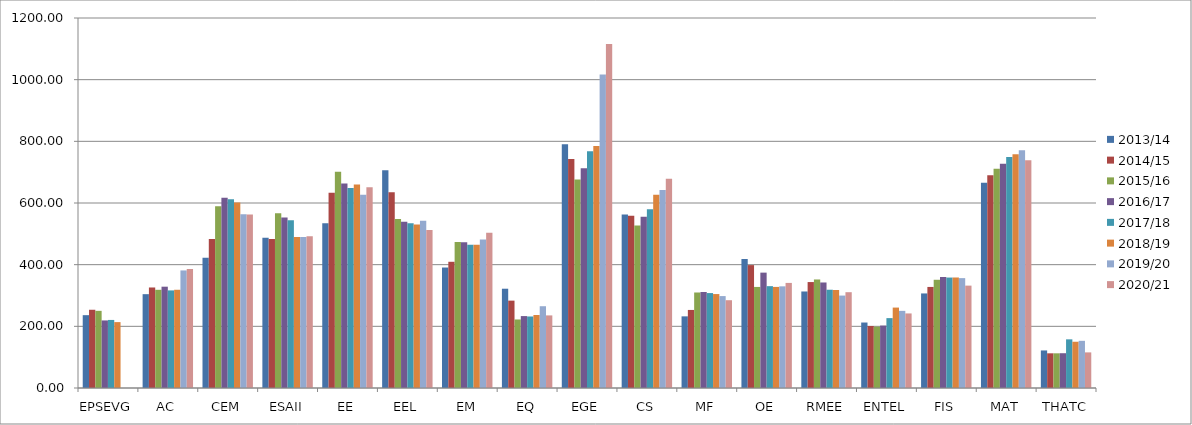
| Category | 2013/14 | 2014/15 | 2015/16 | 2016/17 | 2017/18 | 2018/19 | 2019/20 | 2020/21 |
|---|---|---|---|---|---|---|---|---|
| EPSEVG | 236.21 | 253.76 | 250.25 | 219.142 | 220.742 | 213.699 | 0 | 0 |
| AC | 304.33 | 326 | 318.5 | 328.58 | 316.55 | 318.61 | 381.28 | 385.992 |
| CEM | 422.78 | 483.14 | 589.525 | 617.17 | 612.267 | 601.49 | 563.118 | 563.076 |
| ESAII | 486.94 | 483.27 | 567 | 552.905 | 544.059 | 489.96 | 489.831 | 492.344 |
| EE | 534.44 | 633.19 | 701.6 | 663.57 | 648.45 | 660.34 | 626.371 | 651.352 |
| EEL | 705.89 | 634.64 | 548.15 | 538.866 | 534.172 | 529.952 | 542.478 | 512.481 |
| EM | 390.72 | 409.34 | 473.13 | 472.71 | 464.5 | 464.2 | 481.55 | 503.522 |
| EQ | 321.99 | 283.35 | 222.25 | 233.248 | 231.946 | 236.746 | 265.245 | 235.439 |
| EGE | 790.58 | 742.58 | 675.95 | 712.96 | 767.517 | 785.03 | 1016.44 | 1115.565 |
| CS | 562.37 | 559.01 | 526.91 | 555.16 | 579.6 | 626.94 | 641.92 | 678.764 |
| MF | 232.35 | 253.14 | 309.75 | 311.278 | 307.891 | 304.662 | 298.108 | 284.722 |
| OE | 418.04 | 398.58 | 327.765 | 374.17 | 330.3 | 327.85 | 329.7 | 340.824 |
| RMEE | 313.03 | 343.6 | 351.98 | 342.22 | 318.7 | 317.9 | 299.8 | 310.71 |
| ENTEL | 212.37 | 201.01 | 199 | 202.495 | 226.655 | 260.831 | 250.189 | 241.838 |
| FIS | 306.68 | 327.75 | 351 | 360 | 358.2 | 358.4 | 356.35 | 332.046 |
| MAT | 665.55 | 690 | 710.75 | 727.062 | 749.349 | 758.19 | 770.871 | 739.048 |
| THATC | 121.8 | 112.5 | 112.5 | 112.804 | 157.804 | 150 | 153 | 115.5 |